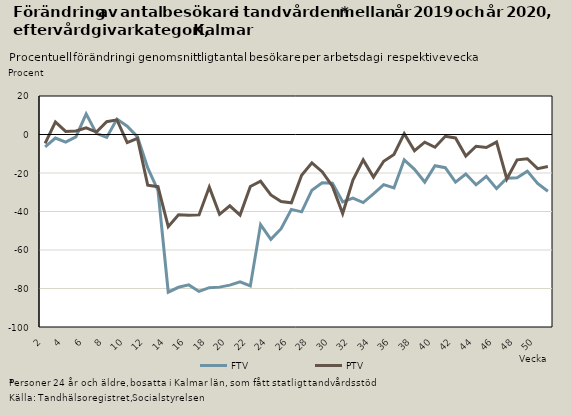
| Category | FTV | PTV |
|---|---|---|
| 2.0 | -6.381 | -4.634 |
| 3.0 | -1.85 | 6.503 |
| 4.0 | -3.96 | 1.586 |
| 5.0 | -1.199 | 1.807 |
| 6.0 | 10.718 | 3.48 |
| 7.0 | 0.558 | 1.251 |
| 8.0 | -1.507 | 6.647 |
| 9.0 | 7.996 | 7.589 |
| 10.0 | 4.331 | -4.244 |
| 11.0 | -1.252 | -2.036 |
| 12.0 | -17.355 | -26.368 |
| 13.0 | -29.089 | -27.114 |
| 14.0 | -81.897 | -47.877 |
| 15.0 | -79.363 | -41.673 |
| 16.0 | -78.128 | -41.971 |
| 17.0 | -81.535 | -41.773 |
| 18.0 | -79.567 | -27.324 |
| 19.0 | -79.289 | -41.459 |
| 20.0 | -78.248 | -37.057 |
| 21.0 | -76.566 | -41.866 |
| 22.0 | -78.69 | -27.022 |
| 23.0 | -46.799 | -24.3 |
| 24.0 | -54.487 | -31.424 |
| 25.0 | -48.924 | -34.86 |
| 26.0 | -38.905 | -35.468 |
| 27.0 | -40.188 | -21.209 |
| 28.0 | -28.933 | -14.703 |
| 29.0 | -25.059 | -19.326 |
| 30.0 | -25.292 | -26.87 |
| 31.0 | -34.959 | -41.036 |
| 32.0 | -33.039 | -23.697 |
| 33.0 | -35.378 | -13.198 |
| 34.0 | -30.805 | -22.136 |
| 35.0 | -26.022 | -13.897 |
| 36.0 | -27.783 | -10.366 |
| 37.0 | -13.145 | 0.449 |
| 38.0 | -18.129 | -8.447 |
| 39.0 | -24.71 | -3.983 |
| 40.0 | -16.22 | -6.623 |
| 41.0 | -17.228 | -0.904 |
| 42.0 | -24.724 | -1.773 |
| 43.0 | -20.507 | -11.196 |
| 44.0 | -26.136 | -6.103 |
| 45.0 | -21.712 | -6.761 |
| 46.0 | -28.102 | -3.928 |
| 47.0 | -22.697 | -23.085 |
| 48.0 | -22.499 | -13.152 |
| 49.0 | -19.036 | -12.616 |
| 50.0 | -25.377 | -17.724 |
| 51.0 | -29.464 | -16.636 |